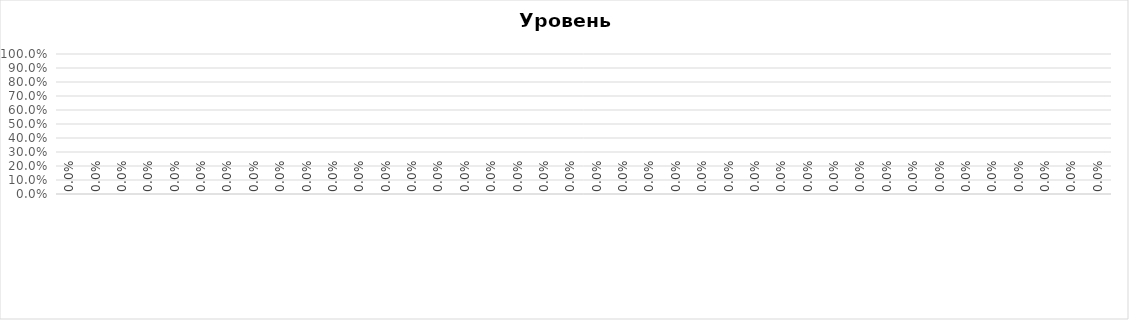
| Category | Уровень обученности |
|---|---|
|   | 0 |
|   | 0 |
|   | 0 |
|   | 0 |
|   | 0 |
|   | 0 |
|   | 0 |
|   | 0 |
|   | 0 |
|   | 0 |
|   | 0 |
|   | 0 |
|   | 0 |
|   | 0 |
|   | 0 |
|   | 0 |
|   | 0 |
|   | 0 |
|   | 0 |
|   | 0 |
|   | 0 |
|   | 0 |
|   | 0 |
|   | 0 |
|   | 0 |
|   | 0 |
|   | 0 |
|   | 0 |
|   | 0 |
|   | 0 |
|   | 0 |
|   | 0 |
|   | 0 |
|   | 0 |
|   | 0 |
|   | 0 |
|   | 0 |
|   | 0 |
|   | 0 |
|   | 0 |